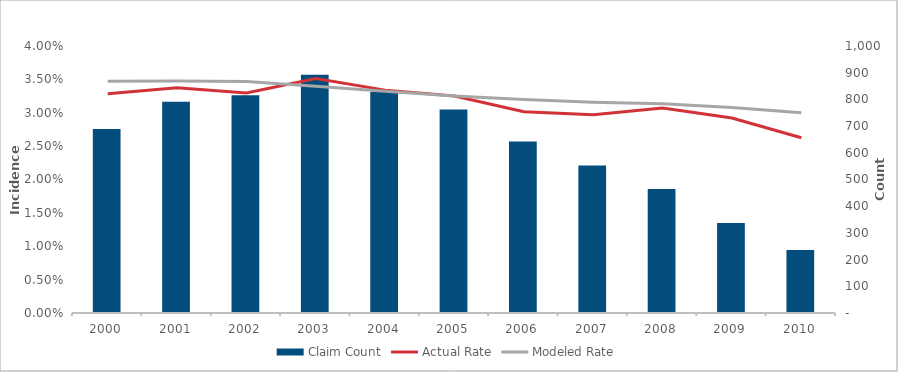
| Category | Claim Count |
|---|---|
| 2000.0 | 689 |
| 2001.0 | 791 |
| 2002.0 | 816 |
| 2003.0 | 892 |
| 2004.0 | 829 |
| 2005.0 | 762 |
| 2006.0 | 642 |
| 2007.0 | 552 |
| 2008.0 | 464 |
| 2009.0 | 337 |
| 2010.0 | 236 |